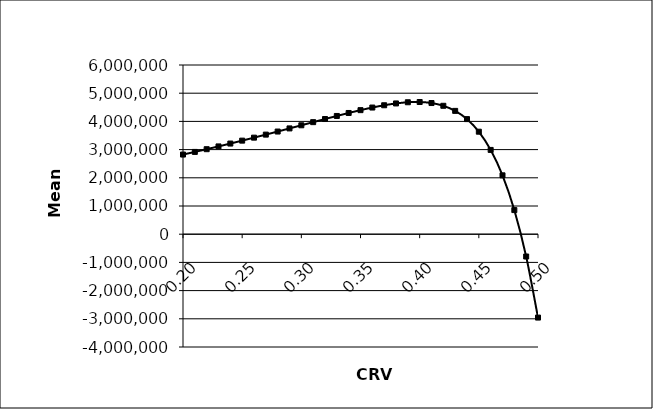
| Category | Total NPV: Mean |
|---|---|
| 0.2 | 2824421.551 |
| 0.21 | 2917970.119 |
| 0.22 | 3014176.355 |
| 0.23 | 3112973.297 |
| 0.24 | 3214261.22 |
| 0.25 | 3317901.158 |
| 0.26 | 3423681.821 |
| 0.27 | 3531359.806 |
| 0.28 | 3640616.34 |
| 0.29 | 3751088.405 |
| 0.3 | 3862276.302 |
| 0.31 | 3973553.48 |
| 0.32 | 4084070.457 |
| 0.33 | 4192902.795 |
| 0.34 | 4298722.021 |
| 0.35 | 4399200.625 |
| 0.36 | 4491573.73 |
| 0.37 | 4572228.792 |
| 0.38 | 4636809.614 |
| 0.39 | 4678682.156 |
| 0.4 | 4687773.443 |
| 0.41 | 4651172.086 |
| 0.42 | 4553377.705 |
| 0.43 | 4372764.021 |
| 0.44 | 4081742.869 |
| 0.45 | 3634869.008 |
| 0.46 | 2988616.27 |
| 0.47 | 2087492.898 |
| 0.48 | 855251.482 |
| 0.49 | -791210.871 |
| 0.5 | -2956183.542 |